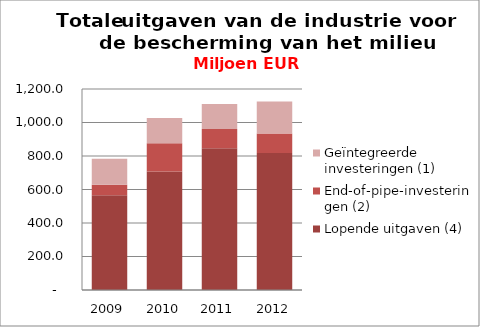
| Category | Lopende uitgaven (4) | End-of-pipe-investeringen (2) | Geïntegreerde investeringen (1) |
|---|---|---|---|
| 2009.0 | 566.1 | 62.8 | 155 |
| 2010.0 | 706.8 | 169.3 | 150.4 |
| 2011.0 | 846.4 | 114.8 | 149.9 |
| 2012.0 | 817.7 | 116.9 | 190.4 |